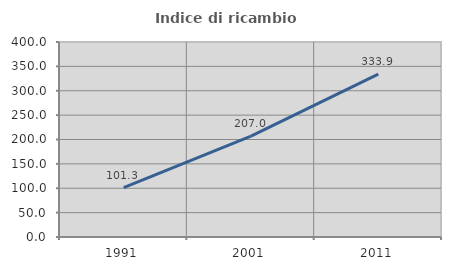
| Category | Indice di ricambio occupazionale  |
|---|---|
| 1991.0 | 101.307 |
| 2001.0 | 206.957 |
| 2011.0 | 333.913 |